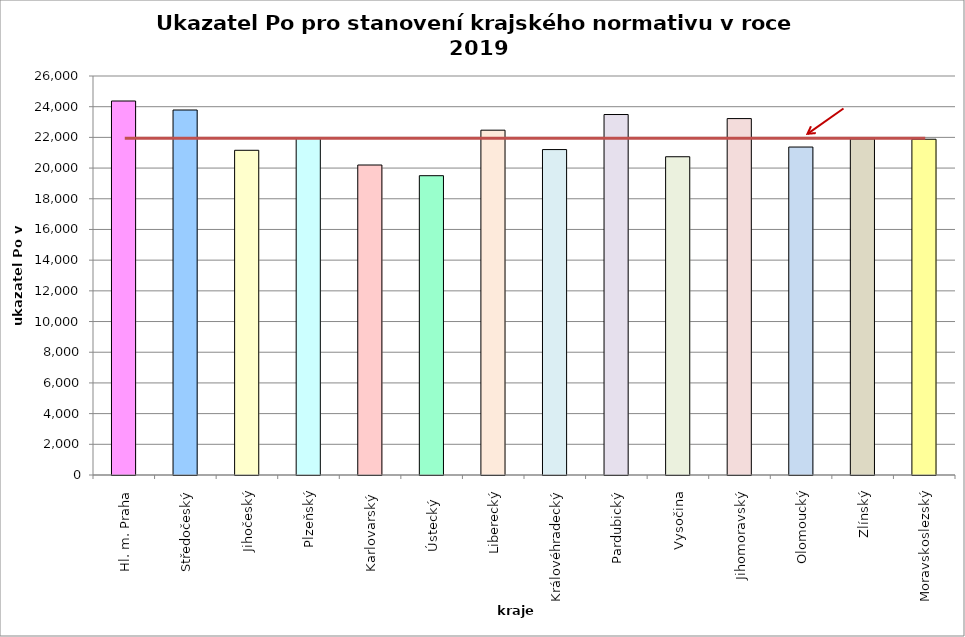
| Category | Series 0 |
|---|---|
| Hl. m. Praha | 24370 |
| Středočeský | 23784 |
| Jihočeský | 21159 |
| Plzeňský | 21960 |
| Karlovarský  | 20200 |
| Ústecký   | 19504 |
| Liberecký | 22470 |
| Královéhradecký | 21206 |
| Pardubický | 23490 |
| Vysočina | 20739 |
| Jihomoravský | 23225 |
| Olomoucký | 21371 |
| Zlínský | 21900 |
| Moravskoslezský | 21880 |